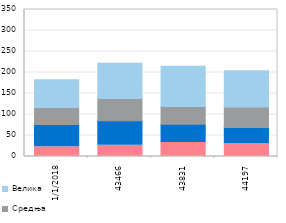
| Category | Микропредузећа | Мала | Средња | Велика |
|---|---|---|---|---|
| 1/1/18 | 23.458 | 52.774 | 40.183 | 66.517 |
| nan | 25.544 | 54.802 | 52.603 | 77.229 |
| nan | 28.673 | 54.873 | 42.484 | 103.899 |
| nan | 37.41 | 70.984 | 51.038 | 152.215 |
| 1/1/19 | 26.913 | 58.293 | 53.033 | 83.702 |
| nan | 35.763 | 61.475 | 78.723 | 111.897 |
| nan | 27.759 | 70.634 | 86.103 | 106.825 |
| nan | 44.489 | 62.561 | 59.132 | 108.665 |
| 1/1/20 | 33.497 | 43.549 | 42.255 | 95.672 |
| nan | 32.96 | 54.335 | 59 | 72.028 |
| nan | 25.293 | 59.78 | 76.792 | 86.501 |
| nan | 37.626 | 49.063 | 68.305 | 103.2 |
| 1/1/21 | 30.617 | 38.71 | 48.392 | 86.375 |